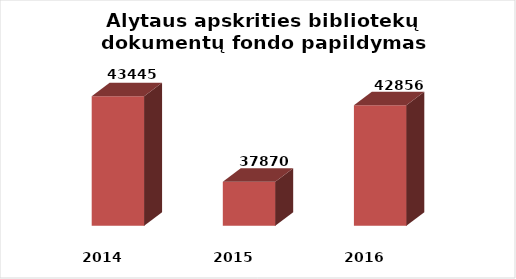
| Category | Series 0 |
|---|---|
| 2014.0 | 43445 |
| 2015.0 | 37870 |
| 2016.0 | 42856 |